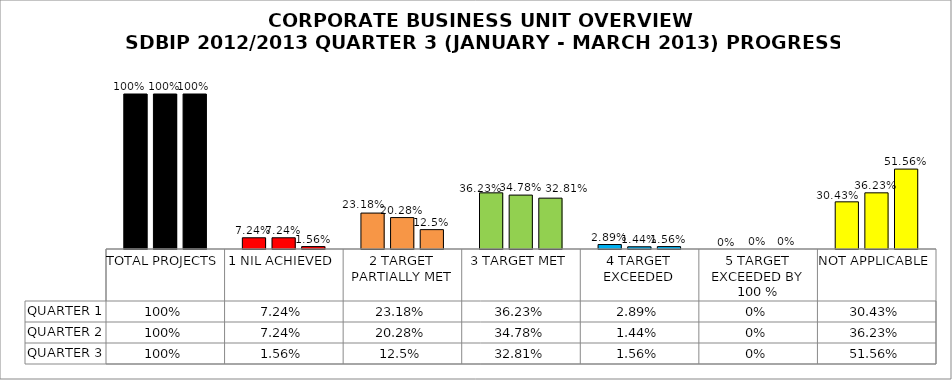
| Category | QUARTER 1 | QUARTER 2 | QUARTER 3 |
|---|---|---|---|
| TOTAL PROJECTS | 1 | 1 | 1 |
| 1 NIL ACHIEVED | 0.072 | 0.072 | 0.016 |
| 2 TARGET PARTIALLY MET | 0.232 | 0.203 | 0.125 |
| 3 TARGET MET | 0.362 | 0.348 | 0.328 |
| 4 TARGET EXCEEDED | 0.029 | 0.014 | 0.016 |
| 5 TARGET EXCEEDED BY 100 % | 0 | 0 | 0 |
| NOT APPLICABLE | 0.304 | 0.362 | 0.516 |